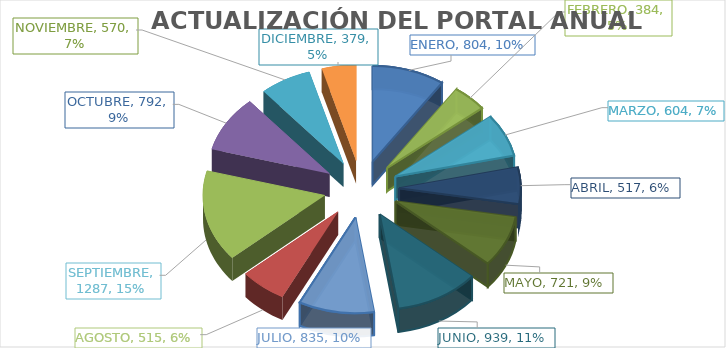
| Category | ACTUALIZACIONES DEL PORTAL |
|---|---|
| ENERO | 804 |
| FEBRERO | 384 |
| MARZO | 604 |
| ABRIL | 517 |
| MAYO | 721 |
| JUNIO | 939 |
| JULIO | 835 |
| AGOSTO | 515 |
| SEPTIEMBRE | 1287 |
| OCTUBRE | 792 |
| NOVIEMBRE | 570 |
| DICIEMBRE | 379 |